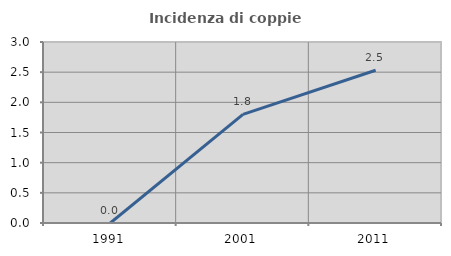
| Category | Incidenza di coppie miste |
|---|---|
| 1991.0 | 0 |
| 2001.0 | 1.799 |
| 2011.0 | 2.532 |